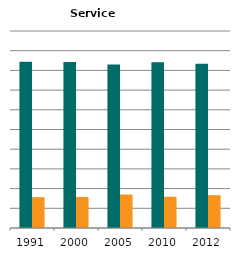
| Category | Male | Female |
|---|---|---|
| 1991.0 | 0.843 | 0.157 |
| 2000.0 | 0.842 | 0.158 |
| 2005.0 | 0.83 | 0.17 |
| 2010.0 | 0.841 | 0.159 |
| 2012.0 | 0.833 | 0.167 |